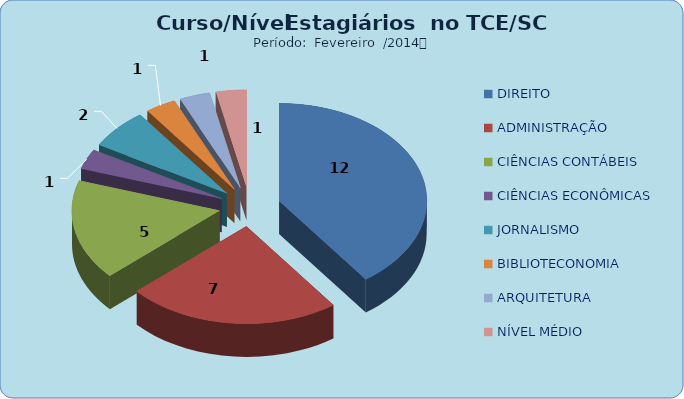
| Category | Series 0 |
|---|---|
| DIREITO | 12 |
| ADMINISTRAÇÃO | 7 |
| CIÊNCIAS CONTÁBEIS | 5 |
| CIÊNCIAS ECONÔMICAS | 1 |
| JORNALISMO | 2 |
| BIBLIOTECONOMIA | 1 |
| ARQUITETURA | 1 |
| NÍVEL MÉDIO | 1 |